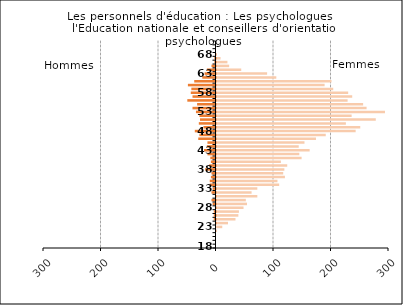
| Category | Series 2 |
|---|---|
| 18.0 | 0 |
| 19.0 | 0 |
| 20.0 | 0 |
| 21.0 | 0 |
| 22.0 | 1 |
| 23.0 | 10 |
| 24.0 | 20 |
| 25.0 | 33 |
| 26.0 | 38 |
| 27.0 | 39 |
| 28.0 | 47 |
| 29.0 | 53 |
| 30.0 | 51 |
| 31.0 | 71 |
| 32.0 | 61 |
| 33.0 | 71 |
| 34.0 | 109 |
| 35.0 | 106 |
| 36.0 | 119 |
| 37.0 | 116 |
| 38.0 | 118 |
| 39.0 | 123 |
| 40.0 | 112 |
| 41.0 | 148 |
| 42.0 | 144 |
| 43.0 | 162 |
| 44.0 | 143 |
| 45.0 | 153 |
| 46.0 | 173 |
| 47.0 | 190 |
| 48.0 | 242 |
| 49.0 | 250 |
| 50.0 | 225 |
| 51.0 | 277 |
| 52.0 | 235 |
| 53.0 | 293 |
| 54.0 | 261 |
| 55.0 | 255 |
| 56.0 | 228 |
| 57.0 | 236 |
| 58.0 | 229 |
| 59.0 | 203 |
| 60.0 | 188 |
| 61.0 | 200 |
| 62.0 | 104 |
| 63.0 | 88 |
| 64.0 | 43 |
| 65.0 | 22 |
| 66.0 | 19 |
| 67.0 | 7 |
| 68.0 | 0 |
| 69.0 | 0 |
| 70.0 | 0 |
| 75.0 | 0 |